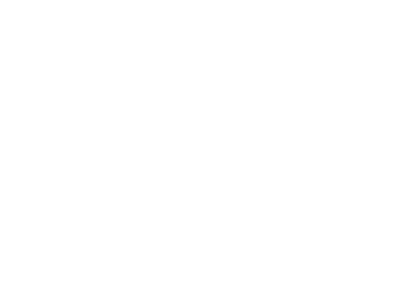
| Category | Total |
|---|---|
| A iniciar | 33 |
| Atrasado | 8 |
| Concluído | 5 |
| Em dia | 46 |
| Suspenso | 1 |